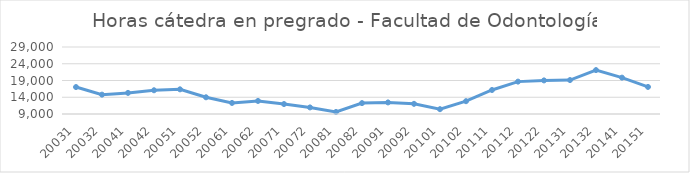
| Category | Total horas |
|---|---|
| 20031 | 17041 |
| 20032 | 14777 |
| 20041 | 15300 |
| 20042 | 16084 |
| 20051 | 16364 |
| 20052 | 13988 |
| 20061 | 12303 |
| 20062 | 12899 |
| 20071 | 11969 |
| 20072 | 10963 |
| 20081 | 9612 |
| 20082 | 12253 |
| 20091 | 12458 |
| 20092 | 12033 |
| 20101 | 10439 |
| 20102 | 12824 |
| 20111 | 16168 |
| 20112 | 18665 |
| 20122 | 19026 |
| 20131 | 19128 |
| 20132 | 22108 |
| 20141 | 19853 |
| 20151 | 17081 |